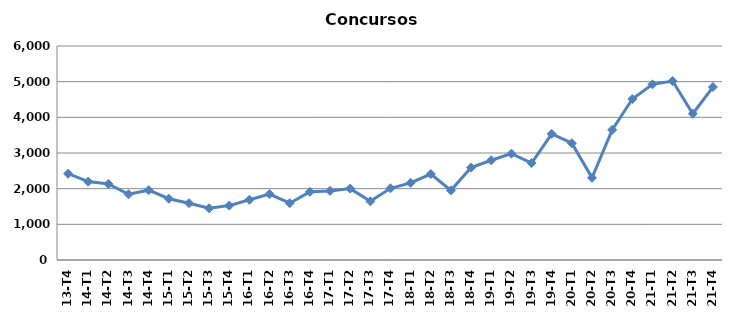
| Category | Concursos |
|---|---|
| 13-T4 | 2419 |
| 14-T1 | 2198 |
| 14-T2 | 2133 |
| 14-T3 | 1843 |
| 14-T4 | 1958 |
| 15-T1 | 1718 |
| 15-T2 | 1593 |
| 15-T3 | 1451 |
| 15-T4 | 1526 |
| 16-T1 | 1689 |
| 16-T2 | 1847 |
| 16-T3 | 1593 |
| 16-T4 | 1911 |
| 17-T1 | 1937 |
| 17-T2 | 2001 |
| 17-T3 | 1645 |
| 17-T4 | 2011 |
| 18-T1 | 2162 |
| 18-T2 | 2410 |
| 18-T3 | 1953 |
| 18-T4 | 2590 |
| 19-T1 | 2796 |
| 19-T2 | 2982 |
| 19-T3 | 2719 |
| 19-T4 | 3534 |
| 20-T1 | 3274 |
| 20-T2 | 2305 |
| 20-T3 | 3649 |
| 20-T4 | 4513 |
| 21-T1 | 4925 |
| 21-T2 | 5017 |
| 21-T3 | 4101 |
| 21-T4 | 4849 |